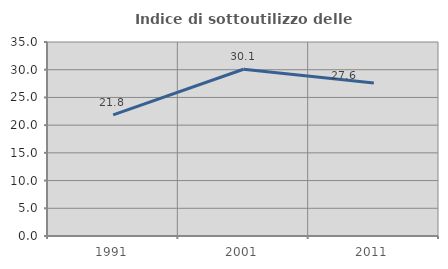
| Category | Indice di sottoutilizzo delle abitazioni  |
|---|---|
| 1991.0 | 21.838 |
| 2001.0 | 30.08 |
| 2011.0 | 27.624 |